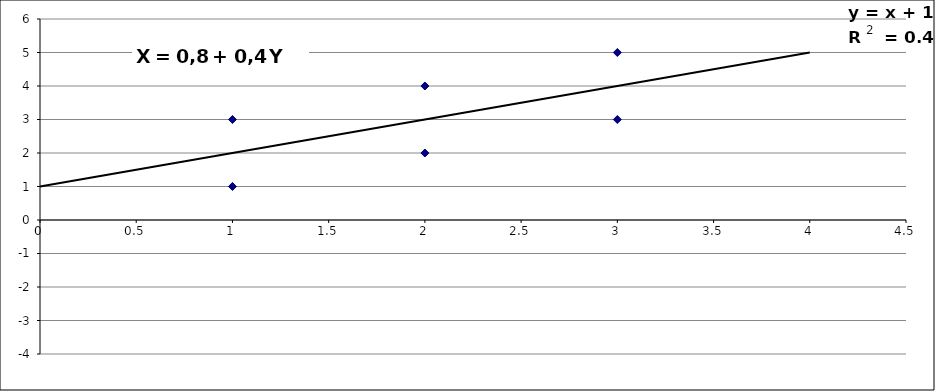
| Category | Yi |
|---|---|
| 1.0 | 1 |
| 1.0 | 3 |
| 2.0 | 2 |
| 2.0 | 4 |
| 3.0 | 3 |
| 3.0 | 5 |